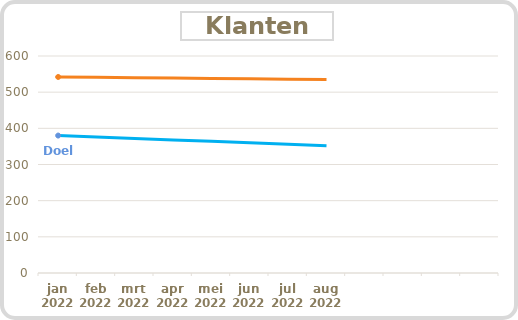
| Category | Klanten | Doel |
|---|---|---|
| jan 2022 | 542 | 380 |
| feb 2022 | 541 | 376 |
| mrt 2022 | 540 | 372 |
| apr 2022 | 539 | 368 |
| mei 2022 | 538 | 364 |
| jun 2022 | 537 | 360 |
| jul 2022 | 536 | 356 |
| aug 2022 | 535 | 352 |